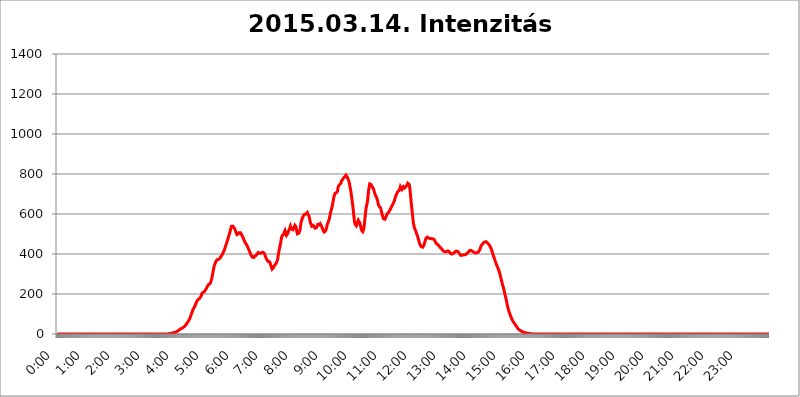
| Category | 2015.03.14. Intenzitás [W/m^2] |
|---|---|
| 0.0 | -0.256 |
| 0.0006944444444444445 | -0.256 |
| 0.001388888888888889 | -0.256 |
| 0.0020833333333333333 | -0.256 |
| 0.002777777777777778 | -0.256 |
| 0.003472222222222222 | -0.256 |
| 0.004166666666666667 | -0.256 |
| 0.004861111111111111 | -0.256 |
| 0.005555555555555556 | -0.256 |
| 0.0062499999999999995 | -0.256 |
| 0.006944444444444444 | -0.256 |
| 0.007638888888888889 | -0.256 |
| 0.008333333333333333 | -0.256 |
| 0.009027777777777779 | -0.256 |
| 0.009722222222222222 | -0.256 |
| 0.010416666666666666 | -0.256 |
| 0.011111111111111112 | -0.256 |
| 0.011805555555555555 | -0.256 |
| 0.012499999999999999 | -0.256 |
| 0.013194444444444444 | -0.256 |
| 0.013888888888888888 | -0.256 |
| 0.014583333333333332 | -0.256 |
| 0.015277777777777777 | -0.256 |
| 0.015972222222222224 | -0.256 |
| 0.016666666666666666 | -0.256 |
| 0.017361111111111112 | -0.256 |
| 0.018055555555555557 | -0.256 |
| 0.01875 | -0.256 |
| 0.019444444444444445 | -0.256 |
| 0.02013888888888889 | -0.256 |
| 0.020833333333333332 | -0.256 |
| 0.02152777777777778 | -0.256 |
| 0.022222222222222223 | -0.256 |
| 0.02291666666666667 | -0.256 |
| 0.02361111111111111 | -0.256 |
| 0.024305555555555556 | -0.256 |
| 0.024999999999999998 | -0.256 |
| 0.025694444444444447 | -0.256 |
| 0.02638888888888889 | -0.256 |
| 0.027083333333333334 | -0.256 |
| 0.027777777777777776 | -0.256 |
| 0.02847222222222222 | -0.256 |
| 0.029166666666666664 | -0.256 |
| 0.029861111111111113 | -0.256 |
| 0.030555555555555555 | -0.256 |
| 0.03125 | -0.256 |
| 0.03194444444444445 | -0.256 |
| 0.03263888888888889 | -0.256 |
| 0.03333333333333333 | -0.256 |
| 0.034027777777777775 | -0.256 |
| 0.034722222222222224 | -0.256 |
| 0.035416666666666666 | -0.256 |
| 0.036111111111111115 | -0.256 |
| 0.03680555555555556 | -0.256 |
| 0.0375 | -0.256 |
| 0.03819444444444444 | -0.256 |
| 0.03888888888888889 | -0.256 |
| 0.03958333333333333 | -0.256 |
| 0.04027777777777778 | -0.256 |
| 0.04097222222222222 | -0.256 |
| 0.041666666666666664 | -0.256 |
| 0.042361111111111106 | -0.256 |
| 0.04305555555555556 | -0.256 |
| 0.043750000000000004 | -0.256 |
| 0.044444444444444446 | -0.256 |
| 0.04513888888888889 | -0.256 |
| 0.04583333333333334 | -0.256 |
| 0.04652777777777778 | -0.256 |
| 0.04722222222222222 | -0.256 |
| 0.04791666666666666 | -0.256 |
| 0.04861111111111111 | -0.256 |
| 0.049305555555555554 | -0.256 |
| 0.049999999999999996 | -0.256 |
| 0.05069444444444445 | -0.256 |
| 0.051388888888888894 | -0.256 |
| 0.052083333333333336 | -0.256 |
| 0.05277777777777778 | -0.256 |
| 0.05347222222222222 | -0.256 |
| 0.05416666666666667 | -0.256 |
| 0.05486111111111111 | -0.256 |
| 0.05555555555555555 | -0.256 |
| 0.05625 | -0.256 |
| 0.05694444444444444 | -0.256 |
| 0.057638888888888885 | -0.256 |
| 0.05833333333333333 | -0.256 |
| 0.05902777777777778 | -0.256 |
| 0.059722222222222225 | -0.256 |
| 0.06041666666666667 | -0.256 |
| 0.061111111111111116 | -0.256 |
| 0.06180555555555556 | -0.256 |
| 0.0625 | -0.256 |
| 0.06319444444444444 | -0.256 |
| 0.06388888888888888 | -0.256 |
| 0.06458333333333334 | -0.256 |
| 0.06527777777777778 | -0.256 |
| 0.06597222222222222 | -0.256 |
| 0.06666666666666667 | -0.256 |
| 0.06736111111111111 | -0.256 |
| 0.06805555555555555 | -0.256 |
| 0.06874999999999999 | -0.256 |
| 0.06944444444444443 | -0.256 |
| 0.07013888888888889 | -0.256 |
| 0.07083333333333333 | -0.256 |
| 0.07152777777777779 | -0.256 |
| 0.07222222222222223 | -0.256 |
| 0.07291666666666667 | -0.256 |
| 0.07361111111111111 | -0.256 |
| 0.07430555555555556 | -0.256 |
| 0.075 | -0.256 |
| 0.07569444444444444 | -0.256 |
| 0.0763888888888889 | -0.256 |
| 0.07708333333333334 | -0.256 |
| 0.07777777777777778 | -0.256 |
| 0.07847222222222222 | -0.256 |
| 0.07916666666666666 | -0.256 |
| 0.0798611111111111 | -0.256 |
| 0.08055555555555556 | -0.256 |
| 0.08125 | -0.256 |
| 0.08194444444444444 | -0.256 |
| 0.08263888888888889 | -0.256 |
| 0.08333333333333333 | -0.256 |
| 0.08402777777777777 | -0.256 |
| 0.08472222222222221 | -0.256 |
| 0.08541666666666665 | -0.256 |
| 0.08611111111111112 | -0.256 |
| 0.08680555555555557 | -0.256 |
| 0.08750000000000001 | -0.256 |
| 0.08819444444444445 | -0.256 |
| 0.08888888888888889 | -0.256 |
| 0.08958333333333333 | -0.256 |
| 0.09027777777777778 | -0.256 |
| 0.09097222222222222 | -0.256 |
| 0.09166666666666667 | -0.256 |
| 0.09236111111111112 | -0.256 |
| 0.09305555555555556 | -0.256 |
| 0.09375 | -0.256 |
| 0.09444444444444444 | -0.256 |
| 0.09513888888888888 | -0.256 |
| 0.09583333333333333 | -0.256 |
| 0.09652777777777777 | -0.256 |
| 0.09722222222222222 | -0.256 |
| 0.09791666666666667 | -0.256 |
| 0.09861111111111111 | -0.256 |
| 0.09930555555555555 | -0.256 |
| 0.09999999999999999 | -0.256 |
| 0.10069444444444443 | -0.256 |
| 0.1013888888888889 | -0.256 |
| 0.10208333333333335 | -0.256 |
| 0.10277777777777779 | -0.256 |
| 0.10347222222222223 | -0.256 |
| 0.10416666666666667 | -0.256 |
| 0.10486111111111111 | -0.256 |
| 0.10555555555555556 | -0.256 |
| 0.10625 | -0.256 |
| 0.10694444444444444 | -0.256 |
| 0.1076388888888889 | -0.256 |
| 0.10833333333333334 | -0.256 |
| 0.10902777777777778 | -0.256 |
| 0.10972222222222222 | -0.256 |
| 0.1111111111111111 | -0.256 |
| 0.11180555555555556 | -0.256 |
| 0.11180555555555556 | -0.256 |
| 0.1125 | -0.256 |
| 0.11319444444444444 | -0.256 |
| 0.11388888888888889 | -0.256 |
| 0.11458333333333333 | -0.256 |
| 0.11527777777777777 | -0.256 |
| 0.11597222222222221 | -0.256 |
| 0.11666666666666665 | -0.256 |
| 0.1173611111111111 | -0.256 |
| 0.11805555555555557 | -0.256 |
| 0.11944444444444445 | -0.256 |
| 0.12013888888888889 | -0.256 |
| 0.12083333333333333 | -0.256 |
| 0.12152777777777778 | -0.256 |
| 0.12222222222222223 | -0.256 |
| 0.12291666666666667 | -0.256 |
| 0.12291666666666667 | -0.256 |
| 0.12361111111111112 | -0.256 |
| 0.12430555555555556 | -0.256 |
| 0.125 | -0.256 |
| 0.12569444444444444 | -0.256 |
| 0.12638888888888888 | -0.256 |
| 0.12708333333333333 | -0.256 |
| 0.16875 | -0.256 |
| 0.12847222222222224 | -0.256 |
| 0.12916666666666668 | -0.256 |
| 0.12986111111111112 | -0.256 |
| 0.13055555555555556 | -0.256 |
| 0.13125 | -0.256 |
| 0.13194444444444445 | -0.256 |
| 0.1326388888888889 | -0.256 |
| 0.13333333333333333 | -0.256 |
| 0.13402777777777777 | -0.256 |
| 0.13402777777777777 | -0.256 |
| 0.13472222222222222 | -0.256 |
| 0.13541666666666666 | -0.256 |
| 0.1361111111111111 | -0.256 |
| 0.13749999999999998 | -0.256 |
| 0.13819444444444443 | -0.256 |
| 0.1388888888888889 | -0.256 |
| 0.13958333333333334 | -0.256 |
| 0.14027777777777778 | -0.256 |
| 0.14097222222222222 | -0.256 |
| 0.14166666666666666 | -0.256 |
| 0.1423611111111111 | -0.256 |
| 0.14305555555555557 | -0.256 |
| 0.14375000000000002 | -0.256 |
| 0.14444444444444446 | -0.256 |
| 0.1451388888888889 | -0.256 |
| 0.1451388888888889 | -0.256 |
| 0.14652777777777778 | -0.256 |
| 0.14722222222222223 | -0.256 |
| 0.14791666666666667 | -0.256 |
| 0.1486111111111111 | -0.256 |
| 0.14930555555555555 | -0.256 |
| 0.15 | -0.256 |
| 0.15069444444444444 | -0.256 |
| 0.15138888888888888 | -0.256 |
| 0.15208333333333332 | -0.256 |
| 0.15277777777777776 | -0.256 |
| 0.15347222222222223 | -0.256 |
| 0.15416666666666667 | -0.256 |
| 0.15486111111111112 | 1.09 |
| 0.15555555555555556 | 1.09 |
| 0.15625 | 1.09 |
| 0.15694444444444444 | 1.09 |
| 0.15763888888888888 | 1.09 |
| 0.15833333333333333 | 2.439 |
| 0.15902777777777777 | 2.439 |
| 0.15972222222222224 | 2.439 |
| 0.16041666666666668 | 3.791 |
| 0.16111111111111112 | 3.791 |
| 0.16180555555555556 | 5.146 |
| 0.1625 | 5.146 |
| 0.16319444444444445 | 6.503 |
| 0.1638888888888889 | 6.503 |
| 0.16458333333333333 | 7.862 |
| 0.16527777777777777 | 9.225 |
| 0.16597222222222222 | 9.225 |
| 0.16666666666666666 | 10.589 |
| 0.1673611111111111 | 11.956 |
| 0.16805555555555554 | 13.325 |
| 0.16874999999999998 | 14.696 |
| 0.16944444444444443 | 16.069 |
| 0.17013888888888887 | 18.822 |
| 0.1708333333333333 | 20.201 |
| 0.17152777777777775 | 22.965 |
| 0.17222222222222225 | 24.35 |
| 0.1729166666666667 | 25.736 |
| 0.17361111111111113 | 27.124 |
| 0.17430555555555557 | 28.514 |
| 0.17500000000000002 | 28.514 |
| 0.17569444444444446 | 29.905 |
| 0.1763888888888889 | 31.297 |
| 0.17708333333333334 | 34.086 |
| 0.17777777777777778 | 35.483 |
| 0.17847222222222223 | 38.28 |
| 0.17916666666666667 | 39.68 |
| 0.1798611111111111 | 42.483 |
| 0.18055555555555555 | 46.695 |
| 0.18125 | 49.507 |
| 0.18194444444444444 | 53.73 |
| 0.1826388888888889 | 56.548 |
| 0.18333333333333335 | 60.778 |
| 0.1840277777777778 | 65.012 |
| 0.18472222222222223 | 69.246 |
| 0.18541666666666667 | 73.481 |
| 0.18611111111111112 | 79.125 |
| 0.18680555555555556 | 86.175 |
| 0.1875 | 93.212 |
| 0.18819444444444444 | 100.233 |
| 0.18888888888888888 | 107.232 |
| 0.18958333333333333 | 114.207 |
| 0.19027777777777777 | 121.152 |
| 0.1909722222222222 | 126.685 |
| 0.19166666666666665 | 130.821 |
| 0.19236111111111112 | 134.943 |
| 0.19305555555555554 | 140.417 |
| 0.19375 | 145.865 |
| 0.19444444444444445 | 152.637 |
| 0.1951388888888889 | 158.022 |
| 0.19583333333333333 | 163.378 |
| 0.19652777777777777 | 167.374 |
| 0.19722222222222222 | 171.353 |
| 0.19791666666666666 | 173.996 |
| 0.1986111111111111 | 175.315 |
| 0.19930555555555554 | 176.631 |
| 0.19999999999999998 | 177.946 |
| 0.20069444444444443 | 180.569 |
| 0.20138888888888887 | 187.091 |
| 0.2020833333333333 | 193.561 |
| 0.2027777777777778 | 201.258 |
| 0.2034722222222222 | 205.079 |
| 0.2041666666666667 | 207.615 |
| 0.20486111111111113 | 208.881 |
| 0.20555555555555557 | 210.144 |
| 0.20625000000000002 | 211.405 |
| 0.20694444444444446 | 213.921 |
| 0.2076388888888889 | 218.93 |
| 0.20833333333333334 | 222.665 |
| 0.20902777777777778 | 227.618 |
| 0.20972222222222223 | 232.54 |
| 0.21041666666666667 | 237.433 |
| 0.2111111111111111 | 242.296 |
| 0.21180555555555555 | 245.925 |
| 0.2125 | 248.335 |
| 0.21319444444444444 | 249.538 |
| 0.2138888888888889 | 250.739 |
| 0.21458333333333335 | 253.137 |
| 0.2152777777777778 | 259.104 |
| 0.21597222222222223 | 267.396 |
| 0.21666666666666667 | 276.797 |
| 0.21736111111111112 | 288.455 |
| 0.21805555555555556 | 302.353 |
| 0.21875 | 316.215 |
| 0.21944444444444444 | 328.955 |
| 0.22013888888888888 | 339.449 |
| 0.22083333333333333 | 347.682 |
| 0.22152777777777777 | 353.613 |
| 0.2222222222222222 | 359.595 |
| 0.22291666666666665 | 365.635 |
| 0.2236111111111111 | 369.291 |
| 0.22430555555555556 | 371.742 |
| 0.225 | 371.742 |
| 0.22569444444444445 | 372.972 |
| 0.2263888888888889 | 372.972 |
| 0.22708333333333333 | 375.442 |
| 0.22777777777777777 | 377.925 |
| 0.22847222222222222 | 380.42 |
| 0.22916666666666666 | 385.455 |
| 0.2298611111111111 | 387.995 |
| 0.23055555555555554 | 391.834 |
| 0.23124999999999998 | 395.711 |
| 0.23194444444444443 | 400.943 |
| 0.23263888888888887 | 406.25 |
| 0.2333333333333333 | 411.638 |
| 0.2340277777777778 | 417.112 |
| 0.2347222222222222 | 424.085 |
| 0.2354166666666667 | 431.211 |
| 0.23611111111111113 | 439.982 |
| 0.23680555555555557 | 447.487 |
| 0.23750000000000002 | 455.184 |
| 0.23819444444444446 | 463.083 |
| 0.2388888888888889 | 469.557 |
| 0.23958333333333334 | 477.854 |
| 0.24027777777777778 | 486.389 |
| 0.24097222222222223 | 495.176 |
| 0.24166666666666667 | 502.396 |
| 0.2423611111111111 | 511.671 |
| 0.24305555555555555 | 521.237 |
| 0.24375 | 531.108 |
| 0.24444444444444446 | 539.234 |
| 0.24513888888888888 | 543.376 |
| 0.24583333333333335 | 541.298 |
| 0.2465277777777778 | 539.234 |
| 0.24722222222222223 | 535.145 |
| 0.24791666666666667 | 531.108 |
| 0.24861111111111112 | 529.108 |
| 0.24930555555555556 | 523.186 |
| 0.25 | 515.462 |
| 0.25069444444444444 | 507.927 |
| 0.2513888888888889 | 502.396 |
| 0.2520833333333333 | 496.965 |
| 0.25277777777777777 | 495.176 |
| 0.2534722222222222 | 496.965 |
| 0.25416666666666665 | 500.575 |
| 0.2548611111111111 | 506.072 |
| 0.2555555555555556 | 507.927 |
| 0.25625000000000003 | 507.927 |
| 0.2569444444444445 | 506.072 |
| 0.2576388888888889 | 504.229 |
| 0.25833333333333336 | 498.764 |
| 0.2590277777777778 | 493.398 |
| 0.25972222222222224 | 488.126 |
| 0.2604166666666667 | 482.945 |
| 0.2611111111111111 | 477.854 |
| 0.26180555555555557 | 471.198 |
| 0.2625 | 464.688 |
| 0.26319444444444445 | 459.898 |
| 0.2638888888888889 | 455.184 |
| 0.26458333333333334 | 452.082 |
| 0.2652777777777778 | 447.487 |
| 0.2659722222222222 | 442.962 |
| 0.26666666666666666 | 438.503 |
| 0.2673611111111111 | 432.656 |
| 0.26805555555555555 | 426.916 |
| 0.26875 | 422.678 |
| 0.26944444444444443 | 415.735 |
| 0.2701388888888889 | 408.934 |
| 0.2708333333333333 | 402.262 |
| 0.27152777777777776 | 395.711 |
| 0.2722222222222222 | 391.834 |
| 0.27291666666666664 | 389.27 |
| 0.2736111111111111 | 384.191 |
| 0.2743055555555555 | 381.674 |
| 0.27499999999999997 | 381.674 |
| 0.27569444444444446 | 382.93 |
| 0.27638888888888885 | 387.995 |
| 0.27708333333333335 | 390.55 |
| 0.2777777777777778 | 391.834 |
| 0.27847222222222223 | 391.834 |
| 0.2791666666666667 | 391.834 |
| 0.2798611111111111 | 395.711 |
| 0.28055555555555556 | 400.943 |
| 0.28125 | 404.916 |
| 0.28194444444444444 | 407.589 |
| 0.2826388888888889 | 406.25 |
| 0.2833333333333333 | 404.916 |
| 0.28402777777777777 | 403.587 |
| 0.2847222222222222 | 402.262 |
| 0.28541666666666665 | 402.262 |
| 0.28611111111111115 | 404.916 |
| 0.28680555555555554 | 407.589 |
| 0.28750000000000003 | 408.934 |
| 0.2881944444444445 | 408.934 |
| 0.2888888888888889 | 407.589 |
| 0.28958333333333336 | 406.25 |
| 0.2902777777777778 | 403.587 |
| 0.29097222222222224 | 398.318 |
| 0.2916666666666667 | 391.834 |
| 0.2923611111111111 | 384.191 |
| 0.29305555555555557 | 377.925 |
| 0.29375 | 372.972 |
| 0.29444444444444445 | 369.291 |
| 0.2951388888888889 | 364.422 |
| 0.29583333333333334 | 362.004 |
| 0.2965277777777778 | 362.004 |
| 0.2972222222222222 | 363.212 |
| 0.29791666666666666 | 360.798 |
| 0.2986111111111111 | 354.805 |
| 0.29930555555555555 | 345.322 |
| 0.3 | 338.278 |
| 0.30069444444444443 | 331.279 |
| 0.3013888888888889 | 324.314 |
| 0.3020833333333333 | 320.84 |
| 0.30277777777777776 | 323.156 |
| 0.3034722222222222 | 332.443 |
| 0.30416666666666664 | 340.62 |
| 0.3048611111111111 | 344.144 |
| 0.3055555555555555 | 346.501 |
| 0.30624999999999997 | 351.235 |
| 0.3069444444444444 | 352.423 |
| 0.3076388888888889 | 351.235 |
| 0.30833333333333335 | 357.196 |
| 0.3090277777777778 | 371.742 |
| 0.30972222222222223 | 389.27 |
| 0.3104166666666667 | 403.587 |
| 0.3111111111111111 | 417.112 |
| 0.31180555555555556 | 429.773 |
| 0.3125 | 441.469 |
| 0.31319444444444444 | 453.629 |
| 0.3138888888888889 | 467.925 |
| 0.3145833333333333 | 482.945 |
| 0.31527777777777777 | 491.63 |
| 0.3159722222222222 | 491.63 |
| 0.31666666666666665 | 491.63 |
| 0.31736111111111115 | 496.965 |
| 0.31805555555555554 | 504.229 |
| 0.31875000000000003 | 511.671 |
| 0.3194444444444445 | 517.375 |
| 0.3201388888888889 | 513.561 |
| 0.32083333333333336 | 502.396 |
| 0.3215277777777778 | 493.398 |
| 0.32222222222222224 | 495.176 |
| 0.3229166666666667 | 500.575 |
| 0.3236111111111111 | 507.927 |
| 0.32430555555555557 | 513.561 |
| 0.325 | 519.3 |
| 0.32569444444444445 | 521.237 |
| 0.3263888888888889 | 531.108 |
| 0.32708333333333334 | 539.234 |
| 0.3277777777777778 | 535.145 |
| 0.3284722222222222 | 525.148 |
| 0.32916666666666666 | 521.237 |
| 0.3298611111111111 | 521.237 |
| 0.33055555555555555 | 521.237 |
| 0.33125 | 525.148 |
| 0.33194444444444443 | 531.108 |
| 0.3326388888888889 | 537.182 |
| 0.3333333333333333 | 543.376 |
| 0.3340277777777778 | 543.376 |
| 0.3347222222222222 | 537.182 |
| 0.3354166666666667 | 523.186 |
| 0.3361111111111111 | 509.793 |
| 0.3368055555555556 | 500.575 |
| 0.33749999999999997 | 498.764 |
| 0.33819444444444446 | 502.396 |
| 0.33888888888888885 | 504.229 |
| 0.33958333333333335 | 506.072 |
| 0.34027777777777773 | 517.375 |
| 0.34097222222222223 | 533.12 |
| 0.3416666666666666 | 551.823 |
| 0.3423611111111111 | 562.699 |
| 0.3430555555555555 | 571.661 |
| 0.34375 | 578.542 |
| 0.3444444444444445 | 585.562 |
| 0.3451388888888889 | 585.562 |
| 0.3458333333333334 | 590.321 |
| 0.34652777777777777 | 597.582 |
| 0.34722222222222227 | 600.035 |
| 0.34791666666666665 | 597.582 |
| 0.34861111111111115 | 600.035 |
| 0.34930555555555554 | 600.035 |
| 0.35000000000000003 | 604.992 |
| 0.3506944444444444 | 607.495 |
| 0.3513888888888889 | 600.035 |
| 0.3520833333333333 | 595.145 |
| 0.3527777777777778 | 592.725 |
| 0.3534722222222222 | 583.206 |
| 0.3541666666666667 | 571.661 |
| 0.3548611111111111 | 560.495 |
| 0.35555555555555557 | 551.823 |
| 0.35625 | 545.467 |
| 0.35694444444444445 | 539.234 |
| 0.3576388888888889 | 539.234 |
| 0.35833333333333334 | 541.298 |
| 0.3590277777777778 | 543.376 |
| 0.3597222222222222 | 539.234 |
| 0.36041666666666666 | 535.145 |
| 0.3611111111111111 | 531.108 |
| 0.36180555555555555 | 529.108 |
| 0.3625 | 531.108 |
| 0.36319444444444443 | 531.108 |
| 0.3638888888888889 | 533.12 |
| 0.3645833333333333 | 539.234 |
| 0.3652777777777778 | 547.572 |
| 0.3659722222222222 | 551.823 |
| 0.3666666666666667 | 547.572 |
| 0.3673611111111111 | 545.467 |
| 0.3680555555555556 | 547.572 |
| 0.36874999999999997 | 551.823 |
| 0.36944444444444446 | 549.691 |
| 0.37013888888888885 | 547.572 |
| 0.37083333333333335 | 539.234 |
| 0.37152777777777773 | 531.108 |
| 0.37222222222222223 | 525.148 |
| 0.3729166666666666 | 519.3 |
| 0.3736111111111111 | 515.462 |
| 0.3743055555555555 | 509.793 |
| 0.375 | 506.072 |
| 0.3756944444444445 | 511.671 |
| 0.3763888888888889 | 515.462 |
| 0.3770833333333334 | 519.3 |
| 0.37777777777777777 | 531.108 |
| 0.37847222222222227 | 545.467 |
| 0.37916666666666665 | 551.823 |
| 0.37986111111111115 | 558.305 |
| 0.38055555555555554 | 564.917 |
| 0.38125000000000003 | 571.661 |
| 0.3819444444444444 | 583.206 |
| 0.3826388888888889 | 595.145 |
| 0.3833333333333333 | 607.495 |
| 0.3840277777777778 | 615.11 |
| 0.3847222222222222 | 625.508 |
| 0.3854166666666667 | 636.194 |
| 0.3861111111111111 | 647.179 |
| 0.38680555555555557 | 661.343 |
| 0.3875 | 676.003 |
| 0.38819444444444445 | 688.102 |
| 0.3888888888888889 | 694.278 |
| 0.38958333333333334 | 703.704 |
| 0.3902777777777778 | 706.89 |
| 0.3909722222222222 | 706.89 |
| 0.39166666666666666 | 706.89 |
| 0.3923611111111111 | 706.89 |
| 0.39305555555555555 | 713.328 |
| 0.39375 | 729.817 |
| 0.39444444444444443 | 739.988 |
| 0.3951388888888889 | 743.425 |
| 0.3958333333333333 | 746.886 |
| 0.3965277777777778 | 746.886 |
| 0.3972222222222222 | 750.371 |
| 0.3979166666666667 | 753.881 |
| 0.3986111111111111 | 764.555 |
| 0.3993055555555556 | 768.162 |
| 0.39999999999999997 | 771.794 |
| 0.40069444444444446 | 775.451 |
| 0.40138888888888885 | 779.134 |
| 0.40208333333333335 | 779.134 |
| 0.40277777777777773 | 782.842 |
| 0.40347222222222223 | 786.575 |
| 0.4041666666666666 | 790.334 |
| 0.4048611111111111 | 794.119 |
| 0.4055555555555555 | 794.119 |
| 0.40625 | 790.334 |
| 0.4069444444444445 | 782.842 |
| 0.4076388888888889 | 775.451 |
| 0.4083333333333334 | 771.794 |
| 0.40902777777777777 | 764.555 |
| 0.40972222222222227 | 753.881 |
| 0.41041666666666665 | 739.988 |
| 0.41111111111111115 | 726.474 |
| 0.41180555555555554 | 713.328 |
| 0.41250000000000003 | 694.278 |
| 0.4131944444444444 | 676.003 |
| 0.4138888888888889 | 658.471 |
| 0.4145833333333333 | 638.912 |
| 0.4152777777777778 | 615.11 |
| 0.4159722222222222 | 590.321 |
| 0.4166666666666667 | 567.15 |
| 0.4173611111111111 | 553.97 |
| 0.41805555555555557 | 547.572 |
| 0.41875 | 543.376 |
| 0.41944444444444445 | 541.298 |
| 0.4201388888888889 | 545.467 |
| 0.42083333333333334 | 553.97 |
| 0.4215277777777778 | 562.699 |
| 0.4222222222222222 | 569.398 |
| 0.42291666666666666 | 571.661 |
| 0.4236111111111111 | 567.15 |
| 0.42430555555555555 | 556.131 |
| 0.425 | 545.467 |
| 0.42569444444444443 | 535.145 |
| 0.4263888888888889 | 525.148 |
| 0.4270833333333333 | 517.375 |
| 0.4277777777777778 | 513.561 |
| 0.4284722222222222 | 511.671 |
| 0.4291666666666667 | 513.561 |
| 0.4298611111111111 | 525.148 |
| 0.4305555555555556 | 543.376 |
| 0.43124999999999997 | 567.15 |
| 0.43194444444444446 | 590.321 |
| 0.43263888888888885 | 615.11 |
| 0.43333333333333335 | 633.495 |
| 0.43402777777777773 | 644.405 |
| 0.43472222222222223 | 655.618 |
| 0.4354166666666666 | 673.03 |
| 0.4361111111111111 | 697.399 |
| 0.4368055555555555 | 719.855 |
| 0.4375 | 736.574 |
| 0.4381944444444445 | 750.371 |
| 0.4388888888888889 | 753.881 |
| 0.4395833333333334 | 750.371 |
| 0.44027777777777777 | 746.886 |
| 0.44097222222222227 | 739.988 |
| 0.44166666666666665 | 736.574 |
| 0.44236111111111115 | 733.184 |
| 0.44305555555555554 | 729.817 |
| 0.44375000000000003 | 723.153 |
| 0.4444444444444444 | 713.328 |
| 0.4451388888888889 | 706.89 |
| 0.4458333333333333 | 697.399 |
| 0.4465277777777778 | 691.18 |
| 0.4472222222222222 | 688.102 |
| 0.4479166666666667 | 682.011 |
| 0.4486111111111111 | 678.997 |
| 0.44930555555555557 | 667.146 |
| 0.45 | 652.786 |
| 0.45069444444444445 | 644.405 |
| 0.4513888888888889 | 638.912 |
| 0.45208333333333334 | 636.194 |
| 0.4527777777777778 | 636.194 |
| 0.4534722222222222 | 630.814 |
| 0.45416666666666666 | 620.273 |
| 0.4548611111111111 | 610.016 |
| 0.45555555555555555 | 600.035 |
| 0.45625 | 590.321 |
| 0.45694444444444443 | 583.206 |
| 0.4576388888888889 | 576.233 |
| 0.4583333333333333 | 571.661 |
| 0.4590277777777778 | 571.661 |
| 0.4597222222222222 | 573.939 |
| 0.4604166666666667 | 578.542 |
| 0.4611111111111111 | 585.562 |
| 0.4618055555555556 | 592.725 |
| 0.46249999999999997 | 600.035 |
| 0.46319444444444446 | 604.992 |
| 0.46388888888888885 | 604.992 |
| 0.46458333333333335 | 607.495 |
| 0.46527777777777773 | 610.016 |
| 0.46597222222222223 | 615.11 |
| 0.4666666666666666 | 620.273 |
| 0.4673611111111111 | 625.508 |
| 0.4680555555555555 | 630.814 |
| 0.46875 | 636.194 |
| 0.4694444444444445 | 641.649 |
| 0.4701388888888889 | 644.405 |
| 0.4708333333333334 | 649.973 |
| 0.47152777777777777 | 655.618 |
| 0.47222222222222227 | 658.471 |
| 0.47291666666666665 | 667.146 |
| 0.47361111111111115 | 676.003 |
| 0.47430555555555554 | 685.046 |
| 0.47500000000000003 | 691.18 |
| 0.4756944444444444 | 697.399 |
| 0.4763888888888889 | 703.704 |
| 0.4770833333333333 | 710.098 |
| 0.4777777777777778 | 713.328 |
| 0.4784722222222222 | 713.328 |
| 0.4791666666666667 | 716.58 |
| 0.4798611111111111 | 719.855 |
| 0.48055555555555557 | 726.474 |
| 0.48125 | 736.574 |
| 0.48194444444444445 | 736.574 |
| 0.4826388888888889 | 733.184 |
| 0.48333333333333334 | 723.153 |
| 0.4840277777777778 | 723.153 |
| 0.4847222222222222 | 726.474 |
| 0.48541666666666666 | 736.574 |
| 0.4861111111111111 | 736.574 |
| 0.48680555555555555 | 729.817 |
| 0.4875 | 729.817 |
| 0.48819444444444443 | 733.184 |
| 0.4888888888888889 | 736.574 |
| 0.4895833333333333 | 739.988 |
| 0.4902777777777778 | 743.425 |
| 0.4909722222222222 | 746.886 |
| 0.4916666666666667 | 753.881 |
| 0.4923611111111111 | 757.414 |
| 0.4930555555555556 | 757.414 |
| 0.49374999999999997 | 746.886 |
| 0.49444444444444446 | 729.817 |
| 0.49513888888888885 | 706.89 |
| 0.49583333333333335 | 682.011 |
| 0.49652777777777773 | 655.618 |
| 0.49722222222222223 | 630.814 |
| 0.4979166666666666 | 607.495 |
| 0.4986111111111111 | 583.206 |
| 0.4993055555555555 | 560.495 |
| 0.5 | 545.467 |
| 0.5006944444444444 | 535.145 |
| 0.5013888888888889 | 527.122 |
| 0.5020833333333333 | 521.237 |
| 0.5027777777777778 | 515.462 |
| 0.5034722222222222 | 507.927 |
| 0.5041666666666667 | 498.764 |
| 0.5048611111111111 | 493.398 |
| 0.5055555555555555 | 486.389 |
| 0.50625 | 477.854 |
| 0.5069444444444444 | 469.557 |
| 0.5076388888888889 | 459.898 |
| 0.5083333333333333 | 452.082 |
| 0.5090277777777777 | 444.463 |
| 0.5097222222222222 | 439.982 |
| 0.5104166666666666 | 437.031 |
| 0.5111111111111112 | 435.566 |
| 0.5118055555555555 | 434.107 |
| 0.5125000000000001 | 434.107 |
| 0.5131944444444444 | 437.031 |
| 0.513888888888889 | 441.469 |
| 0.5145833333333333 | 447.487 |
| 0.5152777777777778 | 456.747 |
| 0.5159722222222222 | 464.688 |
| 0.5166666666666667 | 472.848 |
| 0.517361111111111 | 479.541 |
| 0.5180555555555556 | 482.945 |
| 0.5187499999999999 | 484.662 |
| 0.5194444444444445 | 482.945 |
| 0.5201388888888888 | 481.238 |
| 0.5208333333333334 | 479.541 |
| 0.5215277777777778 | 477.854 |
| 0.5222222222222223 | 476.176 |
| 0.5229166666666667 | 477.854 |
| 0.5236111111111111 | 477.854 |
| 0.5243055555555556 | 476.176 |
| 0.525 | 476.176 |
| 0.5256944444444445 | 476.176 |
| 0.5263888888888889 | 476.176 |
| 0.5270833333333333 | 476.176 |
| 0.5277777777777778 | 476.176 |
| 0.5284722222222222 | 474.507 |
| 0.5291666666666667 | 469.557 |
| 0.5298611111111111 | 464.688 |
| 0.5305555555555556 | 458.318 |
| 0.53125 | 455.184 |
| 0.5319444444444444 | 452.082 |
| 0.5326388888888889 | 450.542 |
| 0.5333333333333333 | 447.487 |
| 0.5340277777777778 | 445.971 |
| 0.5347222222222222 | 442.962 |
| 0.5354166666666667 | 439.982 |
| 0.5361111111111111 | 437.031 |
| 0.5368055555555555 | 434.107 |
| 0.5375 | 432.656 |
| 0.5381944444444444 | 429.773 |
| 0.5388888888888889 | 426.916 |
| 0.5395833333333333 | 422.678 |
| 0.5402777777777777 | 419.883 |
| 0.5409722222222222 | 417.112 |
| 0.5416666666666666 | 414.364 |
| 0.5423611111111112 | 412.998 |
| 0.5430555555555555 | 411.638 |
| 0.5437500000000001 | 411.638 |
| 0.5444444444444444 | 411.638 |
| 0.545138888888889 | 411.638 |
| 0.5458333333333333 | 411.638 |
| 0.5465277777777778 | 412.998 |
| 0.5472222222222222 | 414.364 |
| 0.5479166666666667 | 415.735 |
| 0.548611111111111 | 415.735 |
| 0.5493055555555556 | 412.998 |
| 0.5499999999999999 | 410.283 |
| 0.5506944444444445 | 406.25 |
| 0.5513888888888888 | 403.587 |
| 0.5520833333333334 | 400.943 |
| 0.5527777777777778 | 400.943 |
| 0.5534722222222223 | 399.628 |
| 0.5541666666666667 | 400.943 |
| 0.5548611111111111 | 400.943 |
| 0.5555555555555556 | 403.587 |
| 0.55625 | 404.916 |
| 0.5569444444444445 | 407.589 |
| 0.5576388888888889 | 408.934 |
| 0.5583333333333333 | 411.638 |
| 0.5590277777777778 | 414.364 |
| 0.5597222222222222 | 414.364 |
| 0.5604166666666667 | 415.735 |
| 0.5611111111111111 | 414.364 |
| 0.5618055555555556 | 412.998 |
| 0.5625 | 411.638 |
| 0.5631944444444444 | 407.589 |
| 0.5638888888888889 | 403.587 |
| 0.5645833333333333 | 399.628 |
| 0.5652777777777778 | 395.711 |
| 0.5659722222222222 | 393.122 |
| 0.5666666666666667 | 393.122 |
| 0.5673611111111111 | 393.122 |
| 0.5680555555555555 | 394.415 |
| 0.56875 | 394.415 |
| 0.5694444444444444 | 394.415 |
| 0.5701388888888889 | 395.711 |
| 0.5708333333333333 | 395.711 |
| 0.5715277777777777 | 397.012 |
| 0.5722222222222222 | 397.012 |
| 0.5729166666666666 | 397.012 |
| 0.5736111111111112 | 398.318 |
| 0.5743055555555555 | 400.943 |
| 0.5750000000000001 | 402.262 |
| 0.5756944444444444 | 406.25 |
| 0.576388888888889 | 408.934 |
| 0.5770833333333333 | 411.638 |
| 0.5777777777777778 | 414.364 |
| 0.5784722222222222 | 417.112 |
| 0.5791666666666667 | 418.495 |
| 0.579861111111111 | 418.495 |
| 0.5805555555555556 | 417.112 |
| 0.5812499999999999 | 415.735 |
| 0.5819444444444445 | 414.364 |
| 0.5826388888888888 | 412.998 |
| 0.5833333333333334 | 411.638 |
| 0.5840277777777778 | 408.934 |
| 0.5847222222222223 | 407.589 |
| 0.5854166666666667 | 406.25 |
| 0.5861111111111111 | 404.916 |
| 0.5868055555555556 | 404.916 |
| 0.5875 | 406.25 |
| 0.5881944444444445 | 406.25 |
| 0.5888888888888889 | 406.25 |
| 0.5895833333333333 | 407.589 |
| 0.5902777777777778 | 408.934 |
| 0.5909722222222222 | 411.638 |
| 0.5916666666666667 | 414.364 |
| 0.5923611111111111 | 419.883 |
| 0.5930555555555556 | 425.497 |
| 0.59375 | 432.656 |
| 0.5944444444444444 | 439.982 |
| 0.5951388888888889 | 444.463 |
| 0.5958333333333333 | 447.487 |
| 0.5965277777777778 | 450.542 |
| 0.5972222222222222 | 453.629 |
| 0.5979166666666667 | 456.747 |
| 0.5986111111111111 | 458.318 |
| 0.5993055555555555 | 459.898 |
| 0.6 | 461.486 |
| 0.6006944444444444 | 461.486 |
| 0.6013888888888889 | 461.486 |
| 0.6020833333333333 | 461.486 |
| 0.6027777777777777 | 458.318 |
| 0.6034722222222222 | 455.184 |
| 0.6041666666666666 | 452.082 |
| 0.6048611111111112 | 449.011 |
| 0.6055555555555555 | 445.971 |
| 0.6062500000000001 | 442.962 |
| 0.6069444444444444 | 438.503 |
| 0.607638888888889 | 434.107 |
| 0.6083333333333333 | 428.341 |
| 0.6090277777777778 | 422.678 |
| 0.6097222222222222 | 414.364 |
| 0.6104166666666667 | 406.25 |
| 0.611111111111111 | 398.318 |
| 0.6118055555555556 | 390.55 |
| 0.6124999999999999 | 384.191 |
| 0.6131944444444445 | 376.682 |
| 0.6138888888888888 | 369.291 |
| 0.6145833333333334 | 362.004 |
| 0.6152777777777778 | 354.805 |
| 0.6159722222222223 | 347.682 |
| 0.6166666666666667 | 341.794 |
| 0.6173611111111111 | 335.941 |
| 0.6180555555555556 | 330.117 |
| 0.61875 | 323.156 |
| 0.6194444444444445 | 316.215 |
| 0.6201388888888889 | 309.284 |
| 0.6208333333333333 | 300.041 |
| 0.6215277777777778 | 290.777 |
| 0.6222222222222222 | 280.304 |
| 0.6229166666666667 | 269.754 |
| 0.6236111111111111 | 260.293 |
| 0.6243055555555556 | 250.739 |
| 0.625 | 241.083 |
| 0.6256944444444444 | 232.54 |
| 0.6263888888888889 | 222.665 |
| 0.6270833333333333 | 211.405 |
| 0.6277777777777778 | 201.258 |
| 0.6284722222222222 | 189.685 |
| 0.6291666666666667 | 179.258 |
| 0.6298611111111111 | 168.703 |
| 0.6305555555555555 | 156.678 |
| 0.63125 | 144.506 |
| 0.6319444444444444 | 133.57 |
| 0.6326388888888889 | 123.922 |
| 0.6333333333333333 | 115.598 |
| 0.6340277777777777 | 108.629 |
| 0.6347222222222222 | 101.634 |
| 0.6354166666666666 | 94.617 |
| 0.6361111111111112 | 87.583 |
| 0.6368055555555555 | 81.946 |
| 0.6375000000000001 | 74.892 |
| 0.6381944444444444 | 70.658 |
| 0.638888888888889 | 65.012 |
| 0.6395833333333333 | 62.189 |
| 0.6402777777777778 | 57.958 |
| 0.6409722222222222 | 53.73 |
| 0.6416666666666667 | 50.914 |
| 0.642361111111111 | 46.695 |
| 0.6430555555555556 | 42.483 |
| 0.6437499999999999 | 39.68 |
| 0.6444444444444445 | 35.483 |
| 0.6451388888888888 | 32.691 |
| 0.6458333333333334 | 28.514 |
| 0.6465277777777778 | 25.736 |
| 0.6472222222222223 | 22.965 |
| 0.6479166666666667 | 20.201 |
| 0.6486111111111111 | 18.822 |
| 0.6493055555555556 | 17.444 |
| 0.65 | 16.069 |
| 0.6506944444444445 | 14.696 |
| 0.6513888888888889 | 13.325 |
| 0.6520833333333333 | 11.956 |
| 0.6527777777777778 | 10.589 |
| 0.6534722222222222 | 9.225 |
| 0.6541666666666667 | 9.225 |
| 0.6548611111111111 | 7.862 |
| 0.6555555555555556 | 6.503 |
| 0.65625 | 6.503 |
| 0.6569444444444444 | 5.146 |
| 0.6576388888888889 | 5.146 |
| 0.6583333333333333 | 3.791 |
| 0.6590277777777778 | 3.791 |
| 0.6597222222222222 | 3.791 |
| 0.6604166666666667 | 2.439 |
| 0.6611111111111111 | 2.439 |
| 0.6618055555555555 | 2.439 |
| 0.6625 | 2.439 |
| 0.6631944444444444 | 1.09 |
| 0.6638888888888889 | 1.09 |
| 0.6645833333333333 | 1.09 |
| 0.6652777777777777 | 1.09 |
| 0.6659722222222222 | 1.09 |
| 0.6666666666666666 | -0.256 |
| 0.6673611111111111 | -0.256 |
| 0.6680555555555556 | -0.256 |
| 0.6687500000000001 | -0.256 |
| 0.6694444444444444 | -0.256 |
| 0.6701388888888888 | -0.256 |
| 0.6708333333333334 | -0.256 |
| 0.6715277777777778 | -0.256 |
| 0.6722222222222222 | -0.256 |
| 0.6729166666666666 | -0.256 |
| 0.6736111111111112 | -0.256 |
| 0.6743055555555556 | -0.256 |
| 0.6749999999999999 | -0.256 |
| 0.6756944444444444 | -0.256 |
| 0.6763888888888889 | -0.256 |
| 0.6770833333333334 | -0.256 |
| 0.6777777777777777 | -0.256 |
| 0.6784722222222223 | -0.256 |
| 0.6791666666666667 | -0.256 |
| 0.6798611111111111 | -0.256 |
| 0.6805555555555555 | -0.256 |
| 0.68125 | -0.256 |
| 0.6819444444444445 | -0.256 |
| 0.6826388888888889 | -0.256 |
| 0.6833333333333332 | -0.256 |
| 0.6840277777777778 | -0.256 |
| 0.6847222222222222 | -0.256 |
| 0.6854166666666667 | -0.256 |
| 0.686111111111111 | -0.256 |
| 0.6868055555555556 | -0.256 |
| 0.6875 | -0.256 |
| 0.6881944444444444 | -0.256 |
| 0.688888888888889 | -0.256 |
| 0.6895833333333333 | -0.256 |
| 0.6902777777777778 | -0.256 |
| 0.6909722222222222 | -0.256 |
| 0.6916666666666668 | -0.256 |
| 0.6923611111111111 | -0.256 |
| 0.6930555555555555 | -0.256 |
| 0.69375 | -0.256 |
| 0.6944444444444445 | -0.256 |
| 0.6951388888888889 | -0.256 |
| 0.6958333333333333 | -0.256 |
| 0.6965277777777777 | -0.256 |
| 0.6972222222222223 | -0.256 |
| 0.6979166666666666 | -0.256 |
| 0.6986111111111111 | -0.256 |
| 0.6993055555555556 | -0.256 |
| 0.7000000000000001 | -0.256 |
| 0.7006944444444444 | -0.256 |
| 0.7013888888888888 | -0.256 |
| 0.7020833333333334 | -0.256 |
| 0.7027777777777778 | -0.256 |
| 0.7034722222222222 | -0.256 |
| 0.7041666666666666 | -0.256 |
| 0.7048611111111112 | -0.256 |
| 0.7055555555555556 | -0.256 |
| 0.7062499999999999 | -0.256 |
| 0.7069444444444444 | -0.256 |
| 0.7076388888888889 | -0.256 |
| 0.7083333333333334 | -0.256 |
| 0.7090277777777777 | -0.256 |
| 0.7097222222222223 | -0.256 |
| 0.7104166666666667 | -0.256 |
| 0.7111111111111111 | -0.256 |
| 0.7118055555555555 | -0.256 |
| 0.7125 | -0.256 |
| 0.7131944444444445 | -0.256 |
| 0.7138888888888889 | -0.256 |
| 0.7145833333333332 | -0.256 |
| 0.7152777777777778 | -0.256 |
| 0.7159722222222222 | -0.256 |
| 0.7166666666666667 | -0.256 |
| 0.717361111111111 | -0.256 |
| 0.7180555555555556 | -0.256 |
| 0.71875 | -0.256 |
| 0.7194444444444444 | -0.256 |
| 0.720138888888889 | -0.256 |
| 0.7208333333333333 | -0.256 |
| 0.7215277777777778 | -0.256 |
| 0.7222222222222222 | -0.256 |
| 0.7229166666666668 | -0.256 |
| 0.7236111111111111 | -0.256 |
| 0.7243055555555555 | -0.256 |
| 0.725 | -0.256 |
| 0.7256944444444445 | -0.256 |
| 0.7263888888888889 | -0.256 |
| 0.7270833333333333 | -0.256 |
| 0.7277777777777777 | -0.256 |
| 0.7284722222222223 | -0.256 |
| 0.7291666666666666 | -0.256 |
| 0.7298611111111111 | -0.256 |
| 0.7305555555555556 | -0.256 |
| 0.7312500000000001 | -0.256 |
| 0.7319444444444444 | -0.256 |
| 0.7326388888888888 | -0.256 |
| 0.7333333333333334 | -0.256 |
| 0.7340277777777778 | -0.256 |
| 0.7347222222222222 | -0.256 |
| 0.7354166666666666 | -0.256 |
| 0.7361111111111112 | -0.256 |
| 0.7368055555555556 | -0.256 |
| 0.7374999999999999 | -0.256 |
| 0.7381944444444444 | -0.256 |
| 0.7388888888888889 | -0.256 |
| 0.7395833333333334 | -0.256 |
| 0.7402777777777777 | -0.256 |
| 0.7409722222222223 | -0.256 |
| 0.7416666666666667 | -0.256 |
| 0.7423611111111111 | -0.256 |
| 0.7430555555555555 | -0.256 |
| 0.74375 | -0.256 |
| 0.7444444444444445 | -0.256 |
| 0.7451388888888889 | -0.256 |
| 0.7458333333333332 | -0.256 |
| 0.7465277777777778 | -0.256 |
| 0.7472222222222222 | -0.256 |
| 0.7479166666666667 | -0.256 |
| 0.748611111111111 | -0.256 |
| 0.7493055555555556 | -0.256 |
| 0.75 | -0.256 |
| 0.7506944444444444 | -0.256 |
| 0.751388888888889 | -0.256 |
| 0.7520833333333333 | -0.256 |
| 0.7527777777777778 | -0.256 |
| 0.7534722222222222 | -0.256 |
| 0.7541666666666668 | -0.256 |
| 0.7548611111111111 | -0.256 |
| 0.7555555555555555 | -0.256 |
| 0.75625 | -0.256 |
| 0.7569444444444445 | -0.256 |
| 0.7576388888888889 | -0.256 |
| 0.7583333333333333 | -0.256 |
| 0.7590277777777777 | -0.256 |
| 0.7597222222222223 | -0.256 |
| 0.7604166666666666 | -0.256 |
| 0.7611111111111111 | -0.256 |
| 0.7618055555555556 | -0.256 |
| 0.7625000000000001 | -0.256 |
| 0.7631944444444444 | -0.256 |
| 0.7638888888888888 | -0.256 |
| 0.7645833333333334 | -0.256 |
| 0.7652777777777778 | -0.256 |
| 0.7659722222222222 | -0.256 |
| 0.7666666666666666 | -0.256 |
| 0.7673611111111112 | -0.256 |
| 0.7680555555555556 | -0.256 |
| 0.7687499999999999 | -0.256 |
| 0.7694444444444444 | -0.256 |
| 0.7701388888888889 | -0.256 |
| 0.7708333333333334 | -0.256 |
| 0.7715277777777777 | -0.256 |
| 0.7722222222222223 | -0.256 |
| 0.7729166666666667 | -0.256 |
| 0.7736111111111111 | -0.256 |
| 0.7743055555555555 | -0.256 |
| 0.775 | -0.256 |
| 0.7756944444444445 | -0.256 |
| 0.7763888888888889 | -0.256 |
| 0.7770833333333332 | -0.256 |
| 0.7777777777777778 | -0.256 |
| 0.7784722222222222 | -0.256 |
| 0.7791666666666667 | -0.256 |
| 0.779861111111111 | -0.256 |
| 0.7805555555555556 | -0.256 |
| 0.78125 | -0.256 |
| 0.7819444444444444 | -0.256 |
| 0.782638888888889 | -0.256 |
| 0.7833333333333333 | -0.256 |
| 0.7840277777777778 | -0.256 |
| 0.7847222222222222 | -0.256 |
| 0.7854166666666668 | -0.256 |
| 0.7861111111111111 | -0.256 |
| 0.7868055555555555 | -0.256 |
| 0.7875 | -0.256 |
| 0.7881944444444445 | -0.256 |
| 0.7888888888888889 | -0.256 |
| 0.7895833333333333 | -0.256 |
| 0.7902777777777777 | -0.256 |
| 0.7909722222222223 | -0.256 |
| 0.7916666666666666 | -0.256 |
| 0.7923611111111111 | -0.256 |
| 0.7930555555555556 | -0.256 |
| 0.7937500000000001 | -0.256 |
| 0.7944444444444444 | -0.256 |
| 0.7951388888888888 | -0.256 |
| 0.7958333333333334 | -0.256 |
| 0.7965277777777778 | -0.256 |
| 0.7972222222222222 | -0.256 |
| 0.7979166666666666 | -0.256 |
| 0.7986111111111112 | -0.256 |
| 0.7993055555555556 | -0.256 |
| 0.7999999999999999 | -0.256 |
| 0.8006944444444444 | -0.256 |
| 0.8013888888888889 | -0.256 |
| 0.8020833333333334 | -0.256 |
| 0.8027777777777777 | -0.256 |
| 0.8034722222222223 | -0.256 |
| 0.8041666666666667 | -0.256 |
| 0.8048611111111111 | -0.256 |
| 0.8055555555555555 | -0.256 |
| 0.80625 | -0.256 |
| 0.8069444444444445 | -0.256 |
| 0.8076388888888889 | -0.256 |
| 0.8083333333333332 | -0.256 |
| 0.8090277777777778 | -0.256 |
| 0.8097222222222222 | -0.256 |
| 0.8104166666666667 | -0.256 |
| 0.811111111111111 | -0.256 |
| 0.8118055555555556 | -0.256 |
| 0.8125 | -0.256 |
| 0.8131944444444444 | -0.256 |
| 0.813888888888889 | -0.256 |
| 0.8145833333333333 | -0.256 |
| 0.8152777777777778 | -0.256 |
| 0.8159722222222222 | -0.256 |
| 0.8166666666666668 | -0.256 |
| 0.8173611111111111 | -0.256 |
| 0.8180555555555555 | -0.256 |
| 0.81875 | -0.256 |
| 0.8194444444444445 | -0.256 |
| 0.8201388888888889 | -0.256 |
| 0.8208333333333333 | -0.256 |
| 0.8215277777777777 | -0.256 |
| 0.8222222222222223 | -0.256 |
| 0.8229166666666666 | -0.256 |
| 0.8236111111111111 | -0.256 |
| 0.8243055555555556 | -0.256 |
| 0.8250000000000001 | -0.256 |
| 0.8256944444444444 | -0.256 |
| 0.8263888888888888 | -0.256 |
| 0.8270833333333334 | -0.256 |
| 0.8277777777777778 | -0.256 |
| 0.8284722222222222 | -0.256 |
| 0.8291666666666666 | -0.256 |
| 0.8298611111111112 | -0.256 |
| 0.8305555555555556 | -0.256 |
| 0.8312499999999999 | -0.256 |
| 0.8319444444444444 | -0.256 |
| 0.8326388888888889 | -0.256 |
| 0.8333333333333334 | -0.256 |
| 0.8340277777777777 | -0.256 |
| 0.8347222222222223 | -0.256 |
| 0.8354166666666667 | -0.256 |
| 0.8361111111111111 | -0.256 |
| 0.8368055555555555 | -0.256 |
| 0.8375 | -0.256 |
| 0.8381944444444445 | -0.256 |
| 0.8388888888888889 | -0.256 |
| 0.8395833333333332 | -0.256 |
| 0.8402777777777778 | -0.256 |
| 0.8409722222222222 | -0.256 |
| 0.8416666666666667 | -0.256 |
| 0.842361111111111 | -0.256 |
| 0.8430555555555556 | -0.256 |
| 0.84375 | -0.256 |
| 0.8444444444444444 | -0.256 |
| 0.845138888888889 | -0.256 |
| 0.8458333333333333 | -0.256 |
| 0.8465277777777778 | -0.256 |
| 0.8472222222222222 | -0.256 |
| 0.8479166666666668 | -0.256 |
| 0.8486111111111111 | -0.256 |
| 0.8493055555555555 | -0.256 |
| 0.85 | -0.256 |
| 0.8506944444444445 | -0.256 |
| 0.8513888888888889 | -0.256 |
| 0.8520833333333333 | -0.256 |
| 0.8527777777777777 | -0.256 |
| 0.8534722222222223 | -0.256 |
| 0.8541666666666666 | -0.256 |
| 0.8548611111111111 | -0.256 |
| 0.8555555555555556 | -0.256 |
| 0.8562500000000001 | -0.256 |
| 0.8569444444444444 | -0.256 |
| 0.8576388888888888 | -0.256 |
| 0.8583333333333334 | -0.256 |
| 0.8590277777777778 | -0.256 |
| 0.8597222222222222 | -0.256 |
| 0.8604166666666666 | -0.256 |
| 0.8611111111111112 | -0.256 |
| 0.8618055555555556 | -0.256 |
| 0.8624999999999999 | -0.256 |
| 0.8631944444444444 | -0.256 |
| 0.8638888888888889 | -0.256 |
| 0.8645833333333334 | -0.256 |
| 0.8652777777777777 | -0.256 |
| 0.8659722222222223 | -0.256 |
| 0.8666666666666667 | -0.256 |
| 0.8673611111111111 | -0.256 |
| 0.8680555555555555 | -0.256 |
| 0.86875 | -0.256 |
| 0.8694444444444445 | -0.256 |
| 0.8701388888888889 | -0.256 |
| 0.8708333333333332 | -0.256 |
| 0.8715277777777778 | -0.256 |
| 0.8722222222222222 | -0.256 |
| 0.8729166666666667 | -0.256 |
| 0.873611111111111 | -0.256 |
| 0.8743055555555556 | -0.256 |
| 0.875 | -0.256 |
| 0.8756944444444444 | -0.256 |
| 0.876388888888889 | -0.256 |
| 0.8770833333333333 | -0.256 |
| 0.8777777777777778 | -0.256 |
| 0.8784722222222222 | -0.256 |
| 0.8791666666666668 | -0.256 |
| 0.8798611111111111 | -0.256 |
| 0.8805555555555555 | -0.256 |
| 0.88125 | -0.256 |
| 0.8819444444444445 | -0.256 |
| 0.8826388888888889 | -0.256 |
| 0.8833333333333333 | -0.256 |
| 0.8840277777777777 | -0.256 |
| 0.8847222222222223 | -0.256 |
| 0.8854166666666666 | -0.256 |
| 0.8861111111111111 | -0.256 |
| 0.8868055555555556 | -0.256 |
| 0.8875000000000001 | -0.256 |
| 0.8881944444444444 | -0.256 |
| 0.8888888888888888 | -0.256 |
| 0.8895833333333334 | -0.256 |
| 0.8902777777777778 | -0.256 |
| 0.8909722222222222 | -0.256 |
| 0.8916666666666666 | -0.256 |
| 0.8923611111111112 | -0.256 |
| 0.8930555555555556 | -0.256 |
| 0.8937499999999999 | -0.256 |
| 0.8944444444444444 | -0.256 |
| 0.8951388888888889 | -0.256 |
| 0.8958333333333334 | -0.256 |
| 0.8965277777777777 | -0.256 |
| 0.8972222222222223 | -0.256 |
| 0.8979166666666667 | -0.256 |
| 0.8986111111111111 | -0.256 |
| 0.8993055555555555 | -0.256 |
| 0.9 | -0.256 |
| 0.9006944444444445 | -0.256 |
| 0.9013888888888889 | -0.256 |
| 0.9020833333333332 | -0.256 |
| 0.9027777777777778 | -0.256 |
| 0.9034722222222222 | -0.256 |
| 0.9041666666666667 | -0.256 |
| 0.904861111111111 | -0.256 |
| 0.9055555555555556 | -0.256 |
| 0.90625 | -0.256 |
| 0.9069444444444444 | -0.256 |
| 0.907638888888889 | -0.256 |
| 0.9083333333333333 | -0.256 |
| 0.9090277777777778 | -0.256 |
| 0.9097222222222222 | -0.256 |
| 0.9104166666666668 | -0.256 |
| 0.9111111111111111 | -0.256 |
| 0.9118055555555555 | -0.256 |
| 0.9125 | -0.256 |
| 0.9131944444444445 | -0.256 |
| 0.9138888888888889 | -0.256 |
| 0.9145833333333333 | -0.256 |
| 0.9152777777777777 | -0.256 |
| 0.9159722222222223 | -0.256 |
| 0.9166666666666666 | -0.256 |
| 0.9173611111111111 | -0.256 |
| 0.9180555555555556 | -0.256 |
| 0.9187500000000001 | -0.256 |
| 0.9194444444444444 | -0.256 |
| 0.9201388888888888 | -0.256 |
| 0.9208333333333334 | -0.256 |
| 0.9215277777777778 | -0.256 |
| 0.9222222222222222 | -0.256 |
| 0.9229166666666666 | -0.256 |
| 0.9236111111111112 | -0.256 |
| 0.9243055555555556 | -0.256 |
| 0.9249999999999999 | -0.256 |
| 0.9256944444444444 | -0.256 |
| 0.9263888888888889 | -0.256 |
| 0.9270833333333334 | -0.256 |
| 0.9277777777777777 | -0.256 |
| 0.9284722222222223 | -0.256 |
| 0.9291666666666667 | -0.256 |
| 0.9298611111111111 | -0.256 |
| 0.9305555555555555 | -0.256 |
| 0.93125 | -0.256 |
| 0.9319444444444445 | -0.256 |
| 0.9326388888888889 | -0.256 |
| 0.9333333333333332 | -0.256 |
| 0.9340277777777778 | -0.256 |
| 0.9347222222222222 | -0.256 |
| 0.9354166666666667 | -0.256 |
| 0.936111111111111 | -0.256 |
| 0.9368055555555556 | -0.256 |
| 0.9375 | -0.256 |
| 0.9381944444444444 | -0.256 |
| 0.938888888888889 | -0.256 |
| 0.9395833333333333 | -0.256 |
| 0.9402777777777778 | -0.256 |
| 0.9409722222222222 | -0.256 |
| 0.9416666666666668 | -0.256 |
| 0.9423611111111111 | -0.256 |
| 0.9430555555555555 | -0.256 |
| 0.94375 | -0.256 |
| 0.9444444444444445 | -0.256 |
| 0.9451388888888889 | -0.256 |
| 0.9458333333333333 | -0.256 |
| 0.9465277777777777 | -0.256 |
| 0.9472222222222223 | -0.256 |
| 0.9479166666666666 | -0.256 |
| 0.9486111111111111 | -0.256 |
| 0.9493055555555556 | -0.256 |
| 0.9500000000000001 | -0.256 |
| 0.9506944444444444 | -0.256 |
| 0.9513888888888888 | -0.256 |
| 0.9520833333333334 | -0.256 |
| 0.9527777777777778 | -0.256 |
| 0.9534722222222222 | -0.256 |
| 0.9541666666666666 | -0.256 |
| 0.9548611111111112 | -0.256 |
| 0.9555555555555556 | -0.256 |
| 0.9562499999999999 | -0.256 |
| 0.9569444444444444 | -0.256 |
| 0.9576388888888889 | -0.256 |
| 0.9583333333333334 | -0.256 |
| 0.9590277777777777 | -0.256 |
| 0.9597222222222223 | -0.256 |
| 0.9604166666666667 | -0.256 |
| 0.9611111111111111 | -0.256 |
| 0.9618055555555555 | -0.256 |
| 0.9625 | -0.256 |
| 0.9631944444444445 | -0.256 |
| 0.9638888888888889 | -0.256 |
| 0.9645833333333332 | -0.256 |
| 0.9652777777777778 | -0.256 |
| 0.9659722222222222 | -0.256 |
| 0.9666666666666667 | -0.256 |
| 0.967361111111111 | -0.256 |
| 0.9680555555555556 | -0.256 |
| 0.96875 | -0.256 |
| 0.9694444444444444 | -0.256 |
| 0.970138888888889 | -0.256 |
| 0.9708333333333333 | -0.256 |
| 0.9715277777777778 | -0.256 |
| 0.9722222222222222 | -0.256 |
| 0.9729166666666668 | -0.256 |
| 0.9736111111111111 | -0.256 |
| 0.9743055555555555 | -0.256 |
| 0.975 | -0.256 |
| 0.9756944444444445 | -0.256 |
| 0.9763888888888889 | -0.256 |
| 0.9770833333333333 | -0.256 |
| 0.9777777777777777 | -0.256 |
| 0.9784722222222223 | -0.256 |
| 0.9791666666666666 | -0.256 |
| 0.9798611111111111 | -0.256 |
| 0.9805555555555556 | -0.256 |
| 0.9812500000000001 | -0.256 |
| 0.9819444444444444 | -0.256 |
| 0.9826388888888888 | -0.256 |
| 0.9833333333333334 | -0.256 |
| 0.9840277777777778 | -0.256 |
| 0.9847222222222222 | -0.256 |
| 0.9854166666666666 | -0.256 |
| 0.9861111111111112 | -0.256 |
| 0.9868055555555556 | -0.256 |
| 0.9874999999999999 | -0.256 |
| 0.9881944444444444 | -0.256 |
| 0.9888888888888889 | -0.256 |
| 0.9895833333333334 | -0.256 |
| 0.9902777777777777 | -0.256 |
| 0.9909722222222223 | -0.256 |
| 0.9916666666666667 | -0.256 |
| 0.9923611111111111 | -0.256 |
| 0.9930555555555555 | -0.256 |
| 0.99375 | -0.256 |
| 0.9944444444444445 | -0.256 |
| 0.9951388888888889 | -0.256 |
| 0.9958333333333332 | -0.256 |
| 0.9965277777777778 | -0.256 |
| 0.9972222222222222 | -0.256 |
| 0.9979166666666667 | -0.256 |
| 0.998611111111111 | -0.256 |
| 0.9993055555555556 | 0 |